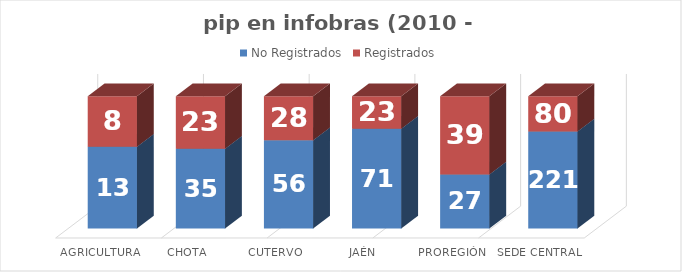
| Category | No Registrados | Registrados |
|---|---|---|
| Agricultura | 13 | 8 |
| Chota | 35 | 23 |
| Cutervo | 56 | 28 |
| Jaén | 71 | 23 |
| Proregión | 27 | 39 |
| Sede Central | 221 | 80 |